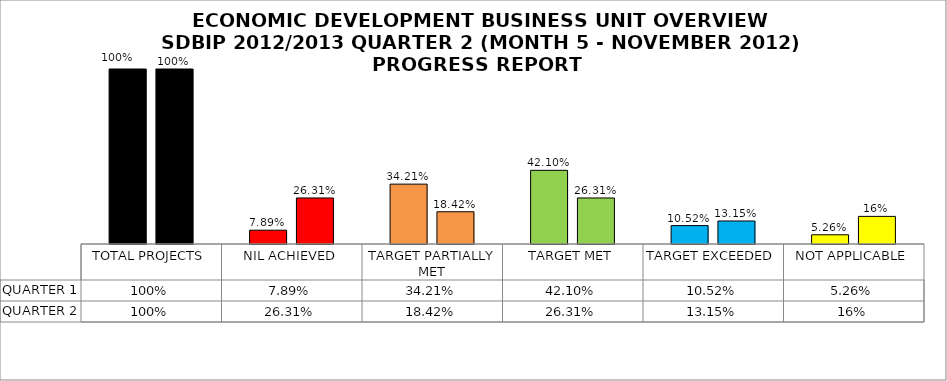
| Category | QUARTER 1 | QUARTER 2 |
|---|---|---|
| TOTAL PROJECTS | 1 | 1 |
| NIL ACHIEVED | 0.079 | 0.263 |
| TARGET PARTIALLY MET | 0.342 | 0.184 |
| TARGET MET | 0.421 | 0.263 |
| TARGET EXCEEDED | 0.105 | 0.132 |
| NOT APPLICABLE | 0.053 | 0.158 |